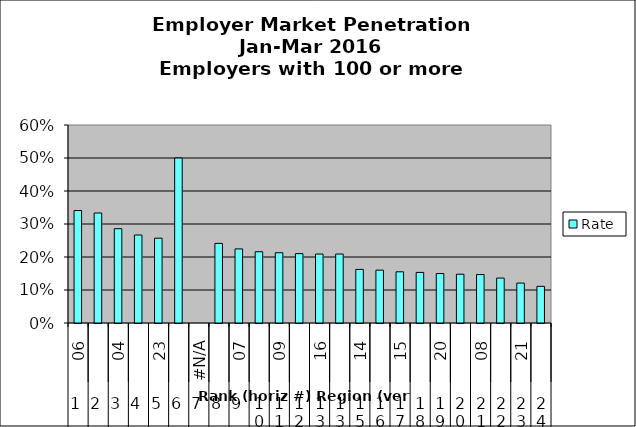
| Category | Rate |
|---|---|
| 0 | 0.341 |
| 1 | 0.333 |
| 2 | 0.286 |
| 3 | 0.267 |
| 4 | 0.257 |
| 5 | 0.5 |
| 6 | 0 |
| 7 | 0.241 |
| 8 | 0.224 |
| 9 | 0.216 |
| 10 | 0.213 |
| 11 | 0.21 |
| 12 | 0.209 |
| 13 | 0.209 |
| 14 | 0.162 |
| 15 | 0.16 |
| 16 | 0.155 |
| 17 | 0.153 |
| 18 | 0.15 |
| 19 | 0.148 |
| 20 | 0.147 |
| 21 | 0.136 |
| 22 | 0.121 |
| 23 | 0.111 |